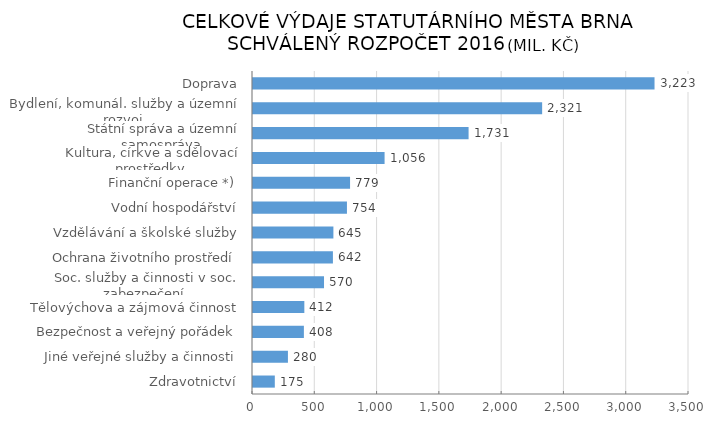
| Category | Series 0 |
|---|---|
|  Zdravotnictví | 175.101 |
|  Jiné veřejné služby a činnosti | 280.405 |
|  Bezpečnost a veřejný pořádek | 408.495 |
|  Tělovýchova a zájmová činnost | 412.11 |
|  Soc. služby a činnosti v soc. zabezpečení | 570.078 |
|  Ochrana životního prostředí | 641.519 |
|  Vzdělávání a školské služby | 645.344 |
|  Vodní hospodářství | 754.178 |
|  Finanční operace *) | 779.16 |
|  Kultura, církve a sdělovací prostředky | 1056.266 |
|  Státní správa a územní samospráva | 1730.619 |
|  Bydlení, komunál. služby a územní rozvoj | 2321.121 |
|  Doprava | 3223.279 |